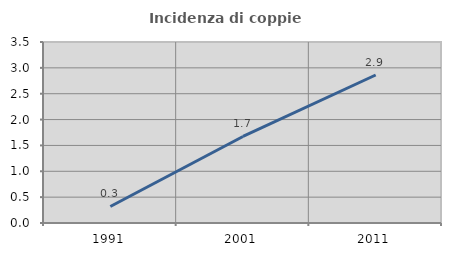
| Category | Incidenza di coppie miste |
|---|---|
| 1991.0 | 0.319 |
| 2001.0 | 1.673 |
| 2011.0 | 2.862 |